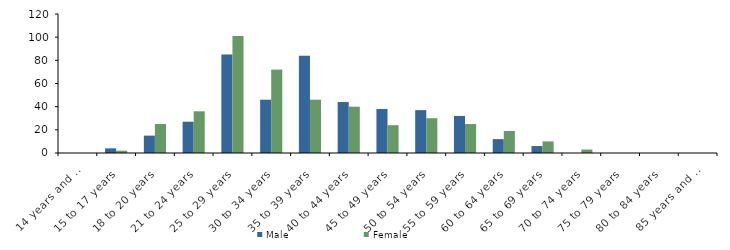
| Category | Male | Female |
|---|---|---|
| 14 years and under | 0 | 0 |
| 15 to 17 years | 4 | 2 |
| 18 to 20 years | 15 | 25 |
| 21 to 24 years | 27 | 36 |
| 25 to 29 years | 85 | 101 |
| 30 to 34 years | 46 | 72 |
| 35 to 39 years | 84 | 46 |
| 40 to 44 years | 44 | 40 |
| 45 to 49 years | 38 | 24 |
| 50 to 54 years | 37 | 30 |
| 55 to 59 years | 32 | 25 |
| 60 to 64 years | 12 | 19 |
| 65 to 69 years | 6 | 10 |
| 70 to 74 years | 0 | 3 |
| 75 to 79 years | 0 | 0 |
| 80 to 84 years | 0 | 0 |
| 85 years and over | 0 | 0 |